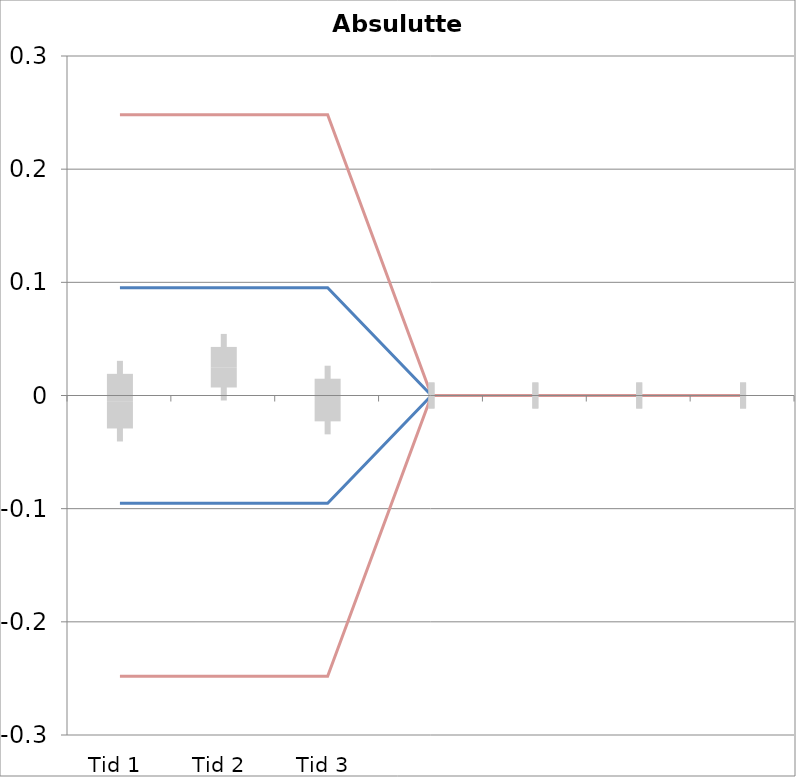
| Category | 1 | 2 | 3 | 4 | 5 | 6 | 7 | 8 | 9 | 10 | 11 | 12 | 13 | 14 | 15 | 16 | 17 | 18 | 19 | 20 | TEa | B | -B | -TEa | M |
|---|---|---|---|---|---|---|---|---|---|---|---|---|---|---|---|---|---|---|---|---|---|---|---|---|---|
| Tid 1 | 0.01 | 0 | 0.05 | -0.06 | -0.04 | 0.03 | 0 | 0.01 | -0.01 | -0.04 | 0 | 0 | 0 | 0 | 0 | 0 | 0 | 0 | 0 | 0 | 0.248 | 0.095 | -0.095 | -0.248 | -0.005 |
| Tid 2 | 0.03 | 0 | 0.02 | 0 | 0.06 | 0.07 | 0.04 | 0.02 | 0 | 0.01 | 0 | 0 | 0 | 0 | 0 | 0 | 0 | 0 | 0 | 0 | 0.248 | 0.095 | -0.095 | -0.248 | 0.025 |
| Tid 3 | -0.04 | 0 | 0.03 | -0.04 | 0.02 | -0.04 | 0.01 | 0.01 | 0 | 0.01 | 0 | 0 | 0 | 0 | 0 | 0 | 0 | 0 | 0 | 0 | 0.248 | 0.095 | -0.095 | -0.248 | -0.004 |